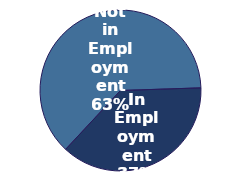
| Category | Series 0 |
|---|---|
| Not in Employment | 0.625 |
| In Employment | 0.375 |